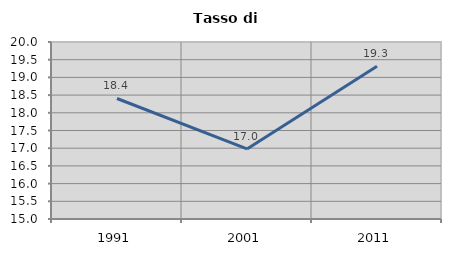
| Category | Tasso di disoccupazione   |
|---|---|
| 1991.0 | 18.404 |
| 2001.0 | 16.979 |
| 2011.0 | 19.316 |